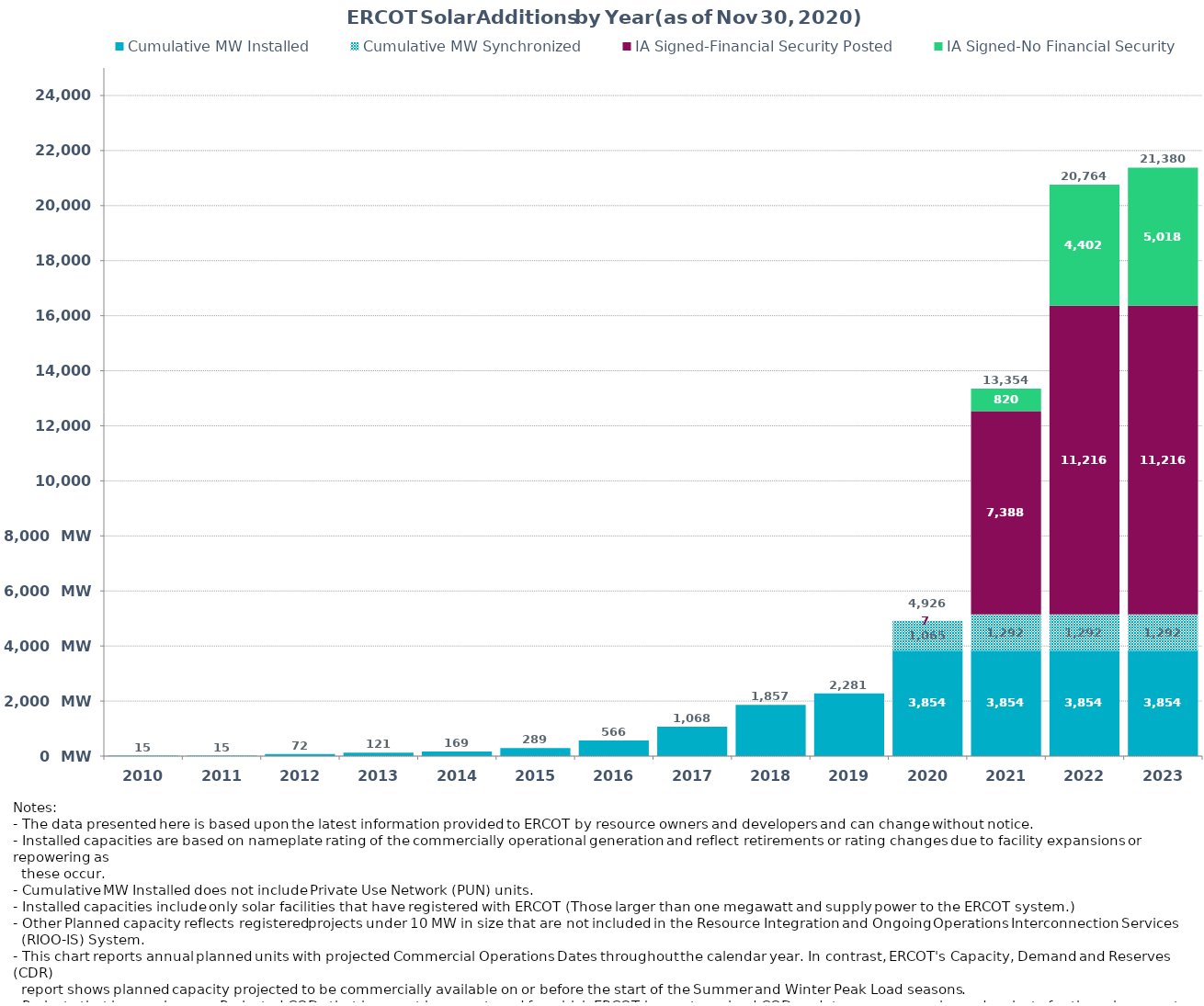
| Category | Cumulative MW Installed | Cumulative MW Synchronized | IA Signed-Financial Security Posted  | IA Signed-No Financial Security  | Other Planned | Cumulative Installed and Planned |
|---|---|---|---|---|---|---|
| 2010.0 | 15 | 0 | 0 | 0 | 0 | 15 |
| 2011.0 | 15 | 0 | 0 | 0 | 0 | 15 |
| 2012.0 | 72.3 | 0 | 0 | 0 | 0 | 72.3 |
| 2013.0 | 121.2 | 0 | 0 | 0 | 0 | 121.2 |
| 2014.0 | 168.7 | 0 | 0 | 0 | 0 | 168.7 |
| 2015.0 | 289.28 | 0 | 0 | 0 | 0 | 289.28 |
| 2016.0 | 565.78 | 0 | 0 | 0 | 0 | 565.78 |
| 2017.0 | 1067.78 | 0 | 0 | 0 | 0 | 1067.78 |
| 2018.0 | 1856.78 | 0 | 0 | 0 | 0 | 1856.78 |
| 2019.0 | 2281.38 | 0 | 0 | 0 | 0 | 2281.38 |
| 2020.0 | 3853.91 | 1065.15 | 7.4 | 0 | 0 | 4926.46 |
| 2021.0 | 3853.91 | 1291.88 | 7388.15 | 819.6 | 0 | 13353.54 |
| 2022.0 | 3853.91 | 1291.88 | 11215.79 | 4402.2 | 0 | 20763.78 |
| 2023.0 | 3853.91 | 1291.88 | 11215.79 | 5018.2 | 0 | 21379.78 |